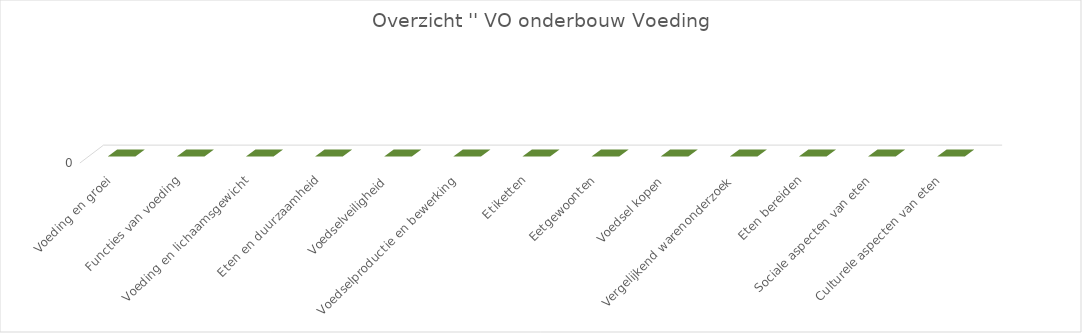
| Category | Series 2 |
|---|---|
| Voeding en groei | 0 |
| Functies van voeding | 0 |
| Voeding en lichaamsgewicht | 0 |
| Eten en duurzaamheid | 0 |
| Voedselveiligheid | 0 |
| Voedselproductie en bewerking | 0 |
| Etiketten | 0 |
| Eetgewoonten | 0 |
| Voedsel kopen | 0 |
| Vergelijkend warenonderzoek | 0 |
| Eten bereiden | 0 |
| Sociale aspecten van eten | 0 |
| Culturele aspecten van eten | 0 |